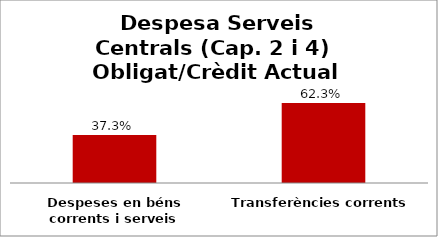
| Category | Series 0 |
|---|---|
| Despeses en béns corrents i serveis | 0.373 |
| Transferències corrents | 0.623 |